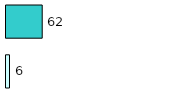
| Category | Series 0 | Series 1 |
|---|---|---|
| 0 | 6 | 62 |